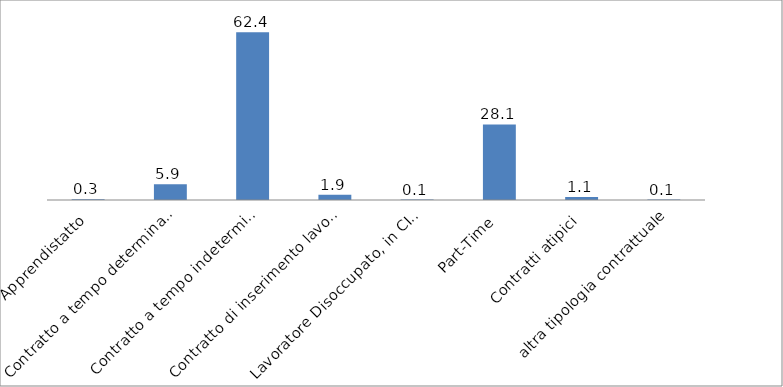
| Category | Series 0 |
|---|---|
| Apprendistatto | 0.273 |
| Contratto a tempo determinato | 5.878 |
| Contratto a tempo indeterminato | 62.45 |
| Contratto di inserimento lavorativo | 1.924 |
| Lavoratore Disoccupato, in CIG/CIGS e in mobilità | 0.145 |
| Part-Time | 28.115 |
| Contratti atipici | 1.071 |
| altra tipologia contrattuale | 0.145 |